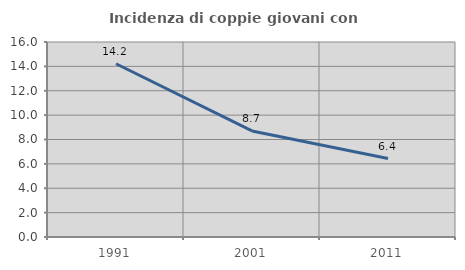
| Category | Incidenza di coppie giovani con figli |
|---|---|
| 1991.0 | 14.216 |
| 2001.0 | 8.702 |
| 2011.0 | 6.435 |